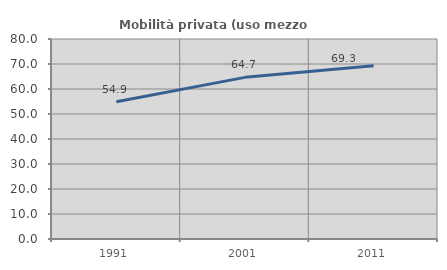
| Category | Mobilità privata (uso mezzo privato) |
|---|---|
| 1991.0 | 54.926 |
| 2001.0 | 64.658 |
| 2011.0 | 69.285 |